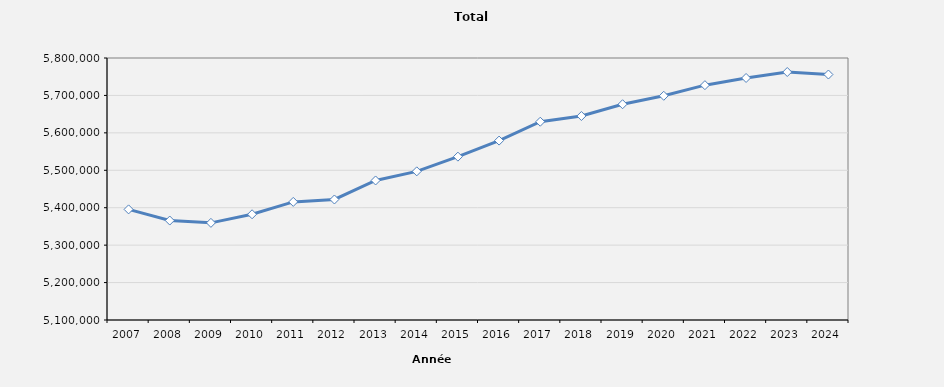
| Category | Total effectifs |
|---|---|
| 2007.0 | 5395548 |
| 2008.0 | 5365725 |
| 2009.0 | 5359527 |
| 2010.0 | 5382470 |
| 2011.0 | 5415587 |
| 2012.0 | 5421987 |
| 2013.0 | 5472782 |
| 2014.0 | 5497135 |
| 2015.0 | 5536422 |
| 2016.0 | 5579355 |
| 2017.0 | 5629771 |
| 2018.0 | 5645018 |
| 2019.0 | 5676483 |
| 2020.0 | 5699030 |
| 2021.0 | 5727408 |
| 2022.0 | 5746619 |
| 2023.0 | 5762563 |
| 2024.0 | 5755860 |